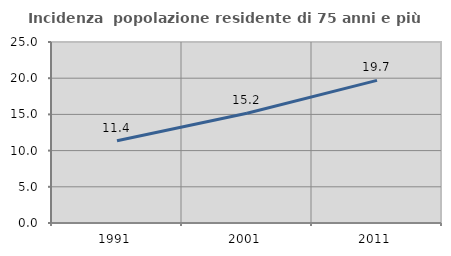
| Category | Incidenza  popolazione residente di 75 anni e più |
|---|---|
| 1991.0 | 11.366 |
| 2001.0 | 15.156 |
| 2011.0 | 19.694 |